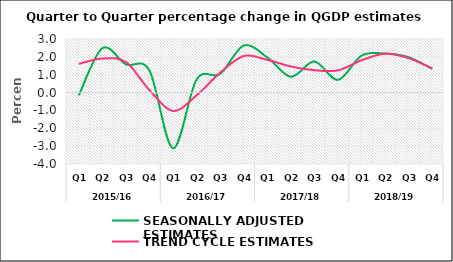
| Category | SEASONALLY ADJUSTED ESTIMATES | TREND CYCLE ESTIMATES |
|---|---|---|
| 0 | -0.155 | 1.605 |
| 1 | 2.485 | 1.907 |
| 2 | 1.582 | 1.707 |
| 3 | 1.231 | 0.135 |
| 4 | -3.118 | -1.029 |
| 5 | 0.73 | -0.155 |
| 6 | 1.047 | 1.114 |
| 7 | 2.633 | 2.047 |
| 8 | 1.969 | 1.834 |
| 9 | 0.887 | 1.46 |
| 10 | 1.74 | 1.252 |
| 11 | 0.712 | 1.244 |
| 12 | 2.069 | 1.81 |
| 13 | 2.187 | 2.177 |
| 14 | 1.981 | 1.926 |
| 15 | 1.322 | 1.352 |